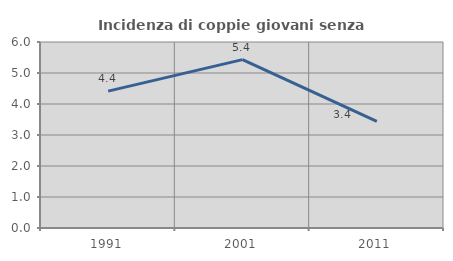
| Category | Incidenza di coppie giovani senza figli |
|---|---|
| 1991.0 | 4.416 |
| 2001.0 | 5.432 |
| 2011.0 | 3.44 |